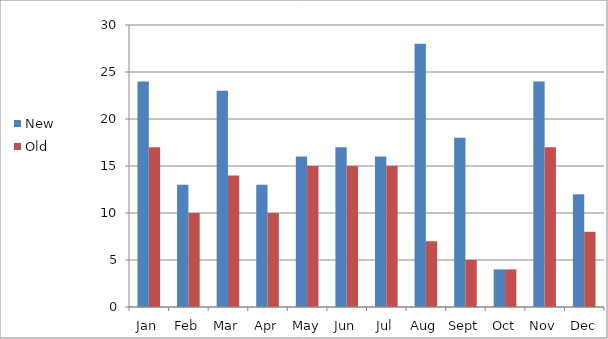
| Category | New | Old |
|---|---|---|
| Jan | 24 | 17 |
| Feb | 13 | 10 |
| Mar | 23 | 14 |
| Apr | 13 | 10 |
| May | 16 | 15 |
| Jun | 17 | 15 |
| Jul | 16 | 15 |
| Aug | 28 | 7 |
| Sept | 18 | 5 |
| Oct | 4 | 4 |
| Nov | 24 | 17 |
| Dec | 12 | 8 |